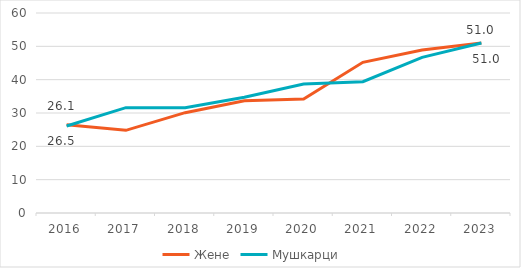
| Category | Жене | Мушкарци |
|---|---|---|
| 2016.0 | 26.5 | 26.1 |
| 2017.0 | 24.8 | 31.6 |
| 2018.0 | 30.1 | 31.6 |
| 2019.0 | 33.7 | 34.7 |
| 2020.0 | 34.2 | 38.7 |
| 2021.0 | 45.2 | 39.4 |
| 2022.0 | 48.9 | 46.7 |
| 2023.0 | 51 | 51 |